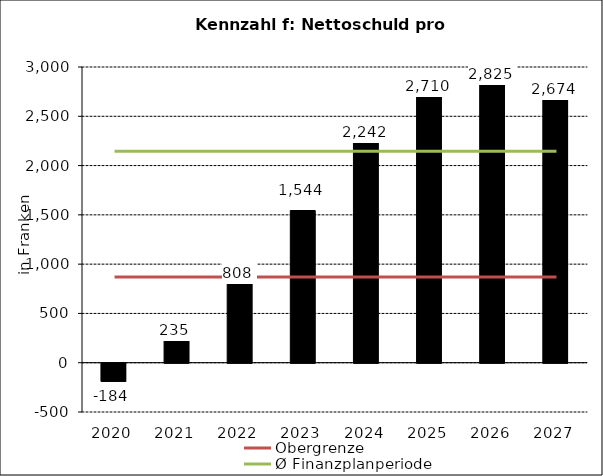
| Category | Nettoschuld pro Einwohnwer |
|---|---|
| 2020.0 | -184.086 |
| 2021.0 | 235.34 |
| 2022.0 | 808.1 |
| 2023.0 | 1544.121 |
| 2024.0 | 2242.075 |
| 2025.0 | 2710.082 |
| 2026.0 | 2824.848 |
| 2027.0 | 2673.522 |